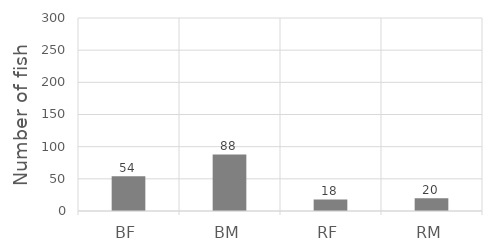
| Category | Series 0 |
|---|---|
| BF | 54 |
| BM | 88 |
| RF | 18 |
| RM | 20 |